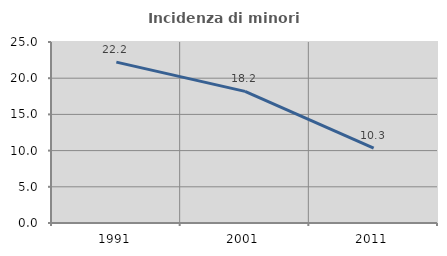
| Category | Incidenza di minori stranieri |
|---|---|
| 1991.0 | 22.222 |
| 2001.0 | 18.182 |
| 2011.0 | 10.345 |